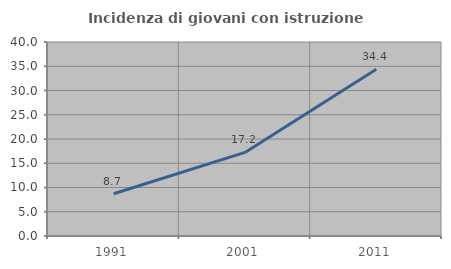
| Category | Incidenza di giovani con istruzione universitaria |
|---|---|
| 1991.0 | 8.705 |
| 2001.0 | 17.237 |
| 2011.0 | 34.36 |